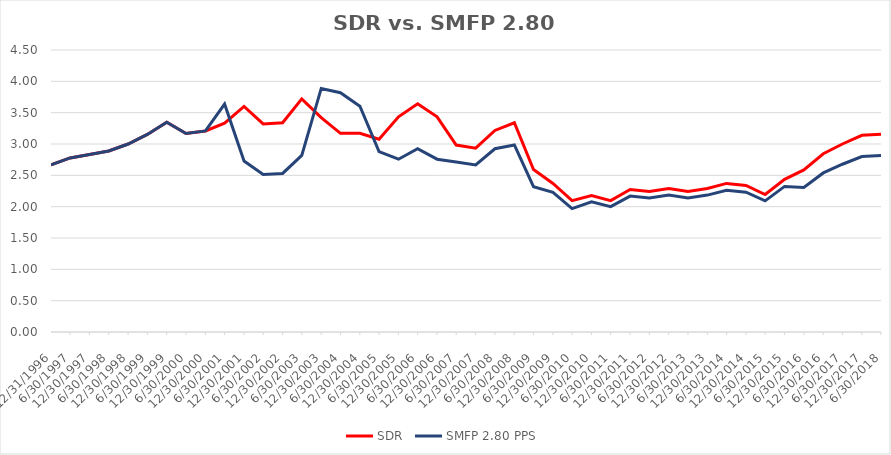
| Category | SDR | SMFP 2.80 PPS |
|---|---|---|
| 12/31/96 | 2.667 | 2.667 |
| 6/30/97 | 2.778 | 2.778 |
| 12/31/97 | 2.833 | 2.833 |
| 6/30/98 | 2.889 | 2.889 |
| 12/31/98 | 3 | 3 |
| 6/30/99 | 3.153 | 3.153 |
| 12/31/99 | 3.347 | 3.347 |
| 6/30/00 | 3.167 | 3.167 |
| 12/31/00 | 3.208 | 3.208 |
| 6/30/01 | 3.333 | 3.636 |
| 12/31/01 | 3.6 | 2.727 |
| 6/30/02 | 3.32 | 2.515 |
| 12/31/02 | 3.34 | 2.53 |
| 6/30/03 | 3.72 | 2.818 |
| 12/31/03 | 3.42 | 3.886 |
| 6/30/04 | 3.17 | 3.818 |
| 12/31/04 | 3.17 | 3.602 |
| 6/30/05 | 3.075 | 2.878 |
| 12/31/05 | 3.434 | 2.758 |
| 6/30/06 | 3.642 | 2.924 |
| 12/31/06 | 3.434 | 2.758 |
| 6/30/07 | 2.983 | 2.712 |
| 12/31/07 | 2.933 | 2.667 |
| 6/30/08 | 3.217 | 2.924 |
| 12/31/08 | 3.339 | 2.985 |
| 6/30/09 | 2.593 | 2.318 |
| 12/31/09 | 2.371 | 2.227 |
| 6/30/10 | 2.097 | 1.97 |
| 12/31/10 | 2.177 | 2.077 |
| 6/30/11 | 2.097 | 2 |
| 12/31/11 | 2.274 | 2.169 |
| 6/30/12 | 2.242 | 2.138 |
| 12/31/12 | 2.29 | 2.185 |
| 6/30/13 | 2.242 | 2.138 |
| 12/31/13 | 2.29 | 2.185 |
| 6/30/14 | 2.371 | 2.262 |
| 12/31/14 | 2.339 | 2.231 |
| 6/30/15 | 2.194 | 2.092 |
| 12/31/15 | 2.435 | 2.323 |
| 6/30/16 | 2.586 | 2.308 |
| 12/31/16 | 2.845 | 2.538 |
| 6/30/17 | 3 | 2.677 |
| 12/31/17 | 3.138 | 2.8 |
| 6/30/18 | 3.155 | 2.815 |